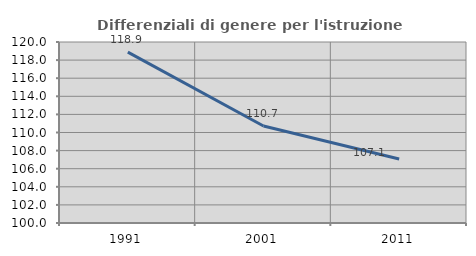
| Category | Differenziali di genere per l'istruzione superiore |
|---|---|
| 1991.0 | 118.877 |
| 2001.0 | 110.713 |
| 2011.0 | 107.071 |